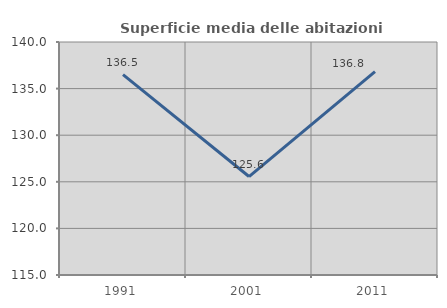
| Category | Superficie media delle abitazioni occupate |
|---|---|
| 1991.0 | 136.5 |
| 2001.0 | 125.565 |
| 2011.0 | 136.826 |